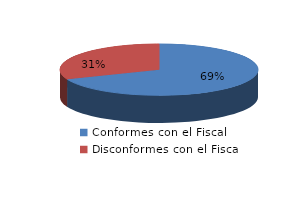
| Category | Series 0 |
|---|---|
| 0 | 1662 |
| 1 | 754 |